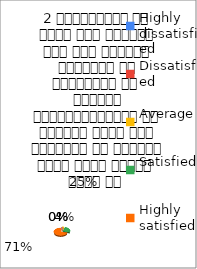
| Category | 2 व्याख्यान से रूचि में वृद्धि हुई एवं शिक्षण जानकारी से परिपूर्ण था 
शिक्षक विद्यार्थियों के द्वारा पूछे गये प्रश्नो का समाधान करने हेतु तत्पर  रहते है  |
|---|---|
| Highly dissatisfied | 0 |
| Dissatisfied | 0 |
| Average | 1 |
| Satisfied | 6 |
| Highly satisfied | 17 |